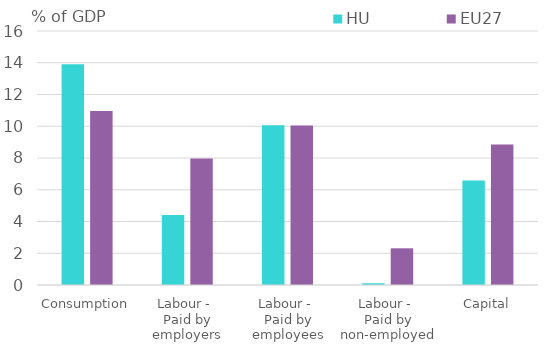
| Category | HU | EU27 |
|---|---|---|
| Consumption | 13.901 | 10.967 |
| Labour - 
Paid by employers | 4.413 | 7.966 |
| Labour - 
Paid by employees | 10.064 | 10.052 |
| Labour - 
Paid by non-employed | 0.109 | 2.311 |
| Capital | 6.584 | 8.858 |